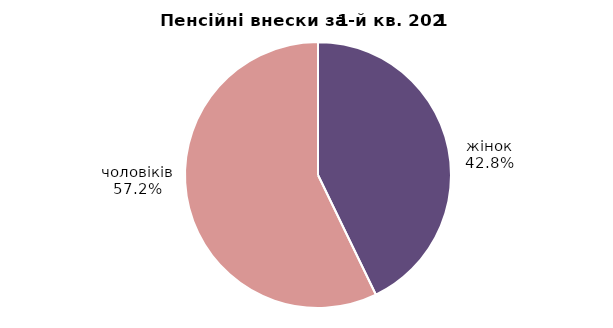
| Category | Series 0 |
|---|---|
| жінок | 20629035.32 |
| чоловіків | 27539068.29 |